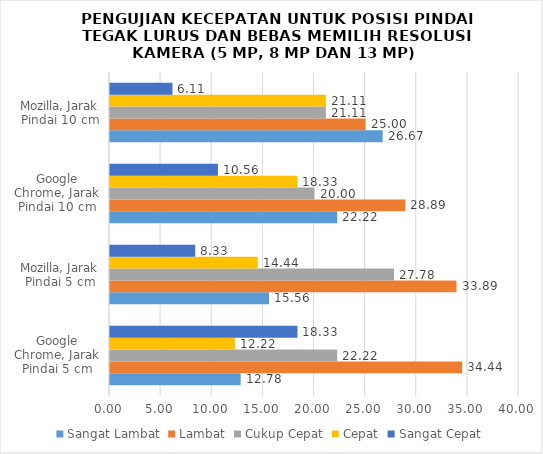
| Category | Sangat Lambat | Lambat | Cukup Cepat | Cepat | Sangat Cepat |
|---|---|---|---|---|---|
| Google Chrome, Jarak Pindai 5 cm | 12.778 | 34.444 | 22.222 | 12.222 | 18.333 |
| Mozilla, Jarak Pindai 5 cm | 15.556 | 33.889 | 27.778 | 14.444 | 8.333 |
| Google Chrome, Jarak Pindai 10 cm | 22.222 | 28.889 | 20 | 18.333 | 10.556 |
| Mozilla, Jarak Pindai 10 cm | 26.667 | 25 | 21.111 | 21.111 | 6.111 |